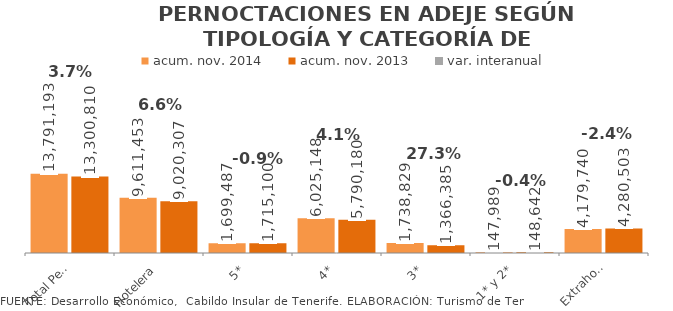
| Category | acum. nov. 2014 | acum. nov. 2013 |
|---|---|---|
| Total Pernoctaciones | 13791193 | 13300810 |
| Hotelera | 9611453 | 9020307 |
| 5* | 1699487 | 1715100 |
| 4* | 6025148 | 5790180 |
| 3* | 1738829 | 1366385 |
| 1* y 2* | 147989 | 148642 |
| Extrahotelera | 4179740 | 4280503 |